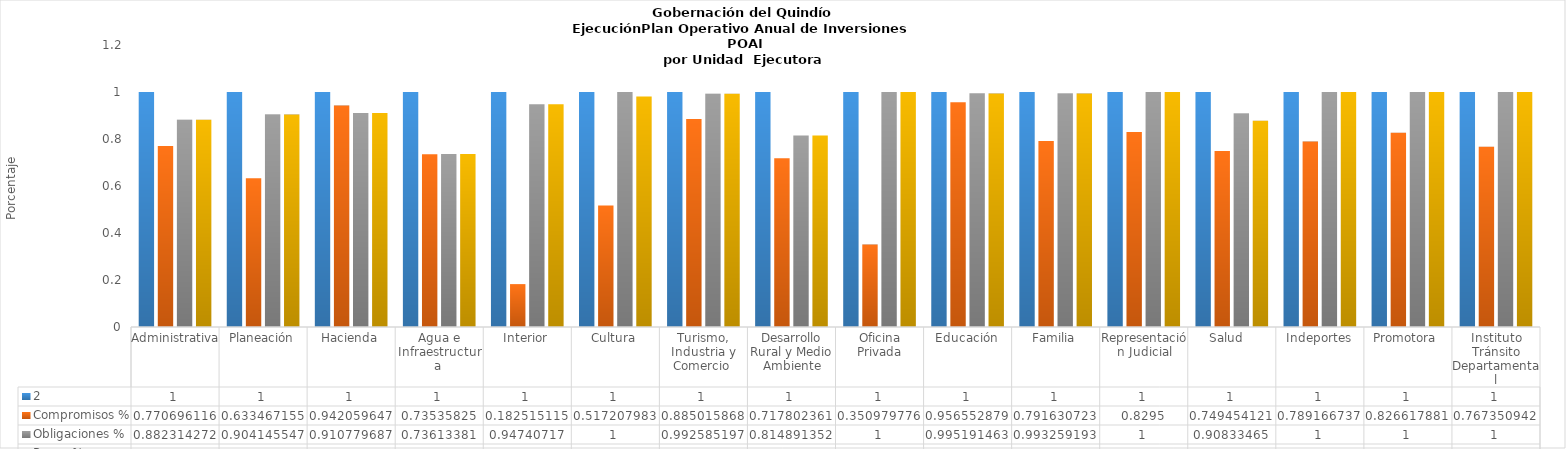
| Category | #N/A | Compromisos % | Obligaciones % | Pagos % |
|---|---|---|---|---|
| Administrativa | 1 | 0.771 | 0.882 | 0.882 |
| Planeación | 1 | 0.633 | 0.904 | 0.904 |
| Hacienda | 1 | 0.942 | 0.911 | 0.911 |
| Agua e Infraestructura  | 1 | 0.735 | 0.736 | 0.736 |
| Interior | 1 | 0.183 | 0.947 | 0.947 |
| Cultura | 1 | 0.517 | 1 | 0.981 |
| Turismo, Industria y Comercio  | 1 | 0.885 | 0.993 | 0.993 |
| Desarrollo Rural y Medio Ambiente | 1 | 0.718 | 0.815 | 0.815 |
| Oficina Privada | 1 | 0.351 | 1 | 1 |
| Educación | 1 | 0.957 | 0.995 | 0.993 |
| Familia | 1 | 0.792 | 0.993 | 0.993 |
| Representación Judicial | 1 | 0.83 | 1 | 1 |
| Salud   | 1 | 0.749 | 0.908 | 0.877 |
| Indeportes | 1 | 0.789 | 1 | 1 |
| Promotora  | 1 | 0.827 | 1 | 1 |
| Instituto Tránsito Departamental | 1 | 0.767 | 1 | 1 |